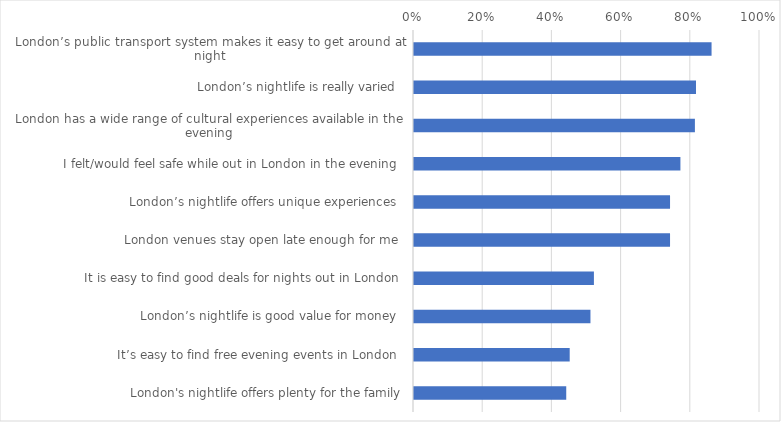
| Category | % Agreement |
|---|---|
| London’s public transport system makes it easy to get around at night
 | 0.86 |
| London’s nightlife is really varied
 | 0.815 |
| London has a wide range of cultural experiences available in the evening
 | 0.812 |
| I felt/would feel safe while out in London in the evening
 | 0.77 |
| London’s nightlife offers unique experiences
 | 0.74 |
| London venues stay open late enough for me
 | 0.74 |
| It is easy to find good deals for nights out in London
 | 0.52 |
| London’s nightlife is good value for money
 | 0.51 |
| It’s easy to find free evening events in London
 | 0.45 |
| London's nightlife offers plenty for the family | 0.44 |